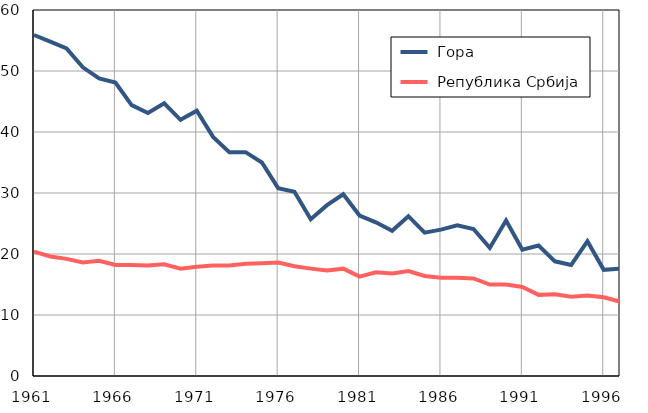
| Category |  Гора |  Република Србија |
|---|---|---|
| 1961.0 | 55.9 | 20.4 |
| 1962.0 | 54.8 | 19.6 |
| 1963.0 | 53.7 | 19.2 |
| 1964.0 | 50.6 | 18.6 |
| 1965.0 | 48.8 | 18.9 |
| 1966.0 | 48.1 | 18.2 |
| 1967.0 | 44.4 | 18.2 |
| 1968.0 | 43.1 | 18.1 |
| 1969.0 | 44.7 | 18.3 |
| 1970.0 | 42 | 17.6 |
| 1971.0 | 43.5 | 17.9 |
| 1972.0 | 39.2 | 18.1 |
| 1973.0 | 36.7 | 18.1 |
| 1974.0 | 36.7 | 18.4 |
| 1975.0 | 35 | 18.5 |
| 1976.0 | 30.8 | 18.6 |
| 1977.0 | 30.2 | 18 |
| 1978.0 | 25.7 | 17.6 |
| 1979.0 | 28 | 17.3 |
| 1980.0 | 29.8 | 17.6 |
| 1981.0 | 26.3 | 16.3 |
| 1982.0 | 25.2 | 17 |
| 1983.0 | 23.8 | 16.8 |
| 1984.0 | 26.2 | 17.2 |
| 1985.0 | 23.5 | 16.4 |
| 1986.0 | 24 | 16.1 |
| 1987.0 | 24.7 | 16.1 |
| 1988.0 | 24.1 | 16 |
| 1989.0 | 21 | 15 |
| 1990.0 | 25.5 | 15 |
| 1991.0 | 20.7 | 14.6 |
| 1992.0 | 21.4 | 13.3 |
| 1993.0 | 18.8 | 13.4 |
| 1994.0 | 18.2 | 13 |
| 1995.0 | 22.1 | 13.2 |
| 1996.0 | 17.4 | 12.9 |
| 1997.0 | 17.6 | 12.2 |